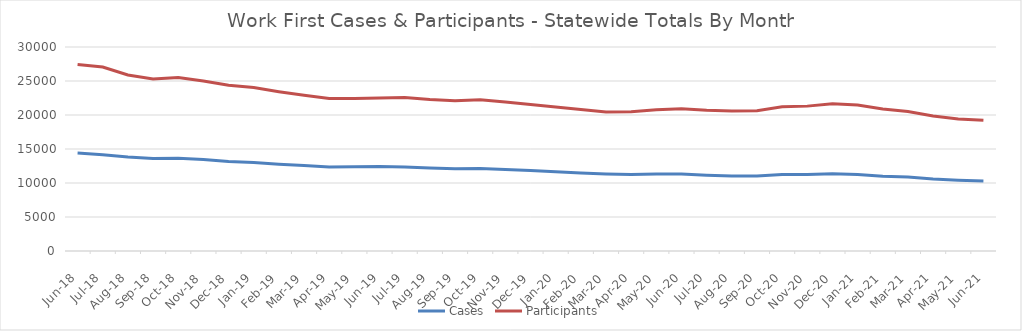
| Category | Cases | Participants |
|---|---|---|
| 2021-06-21 | 10298 | 19211 |
| 2021-05-21 | 10411 | 19413 |
| 2021-04-21 | 10601 | 19845 |
| 2021-03-21 | 10888 | 20521 |
| 2021-02-21 | 11007 | 20877 |
| 2021-01-21 | 11252 | 21466 |
| 2020-12-20 | 11350 | 21641 |
| 2020-11-20 | 11255 | 21305 |
| 2020-10-20 | 11243 | 21198 |
| 2020-09-20 | 11030 | 20626 |
| 2020-08-20 | 11034 | 20575 |
| 2020-07-20 | 11137 | 20693 |
| 2020-06-20 | 11320 | 20921 |
| 2020-05-20 | 11330 | 20766 |
| 2020-04-20 | 11263 | 20490 |
| 2020-03-20 | 11330 | 20431 |
| 2020-02-20 | 11473 | 20821 |
| 2020-01-20 | 11654 | 21174 |
| 2019-12-19 | 11822 | 21539 |
| 2019-11-19 | 11990 | 21921 |
| 2019-10-19 | 12136 | 22233 |
| 2019-09-19 | 12092 | 22105 |
| 2019-08-19 | 12206 | 22284 |
| 2019-07-19 | 12346 | 22563 |
| 2019-06-19 | 12412 | 22512 |
| 2019-05-19 | 12393 | 22436 |
| 2019-04-19 | 12365 | 22412 |
| 2019-03-01 | 12560 | 22890 |
| 2019-02-01 | 12766 | 23428 |
| 2019-01-01 | 13027 | 24029 |
| 2018-12-01 | 13157 | 24372 |
| 2018-11-01 | 13439 | 25009 |
| 2018-10-01 | 13656 | 25510 |
| 2018-09-01 | 13611 | 25301 |
| 2018-08-01 | 13812 | 25882 |
| 2018-07-01 | 14167 | 27056 |
| 2018-06-01 | 14394 | 27436 |